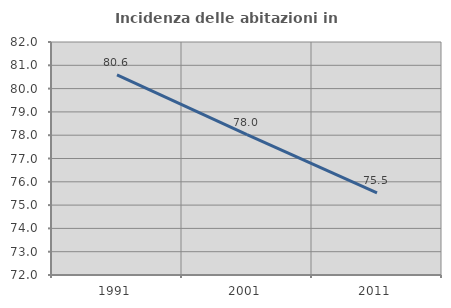
| Category | Incidenza delle abitazioni in proprietà  |
|---|---|
| 1991.0 | 80.587 |
| 2001.0 | 78.025 |
| 2011.0 | 75.523 |